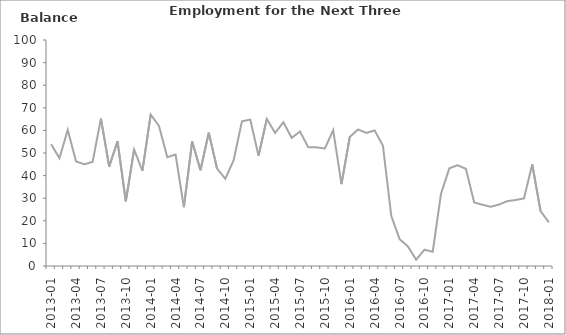
| Category | Balance |
|---|---|
| 2013-01 | 53.9 |
|  | 47.7 |
|  | 60.2 |
| 2013-04 | 46.3 |
|  | 45 |
|  | 46.1 |
| 2013-07 | 65.2 |
|  | 44 |
|  | 55.2 |
| 2013-10 | 28.6 |
|  | 51.5 |
|  | 42.1 |
| 2014-01 | 67 |
|  | 62 |
|  | 48.1 |
| 2014-04 | 49.3 |
|  | 26 |
|  | 55.1 |
| 2014-07 | 42.4 |
|  | 59 |
|  | 43.1 |
| 2014-10 | 38.6 |
|  | 46.8 |
|  | 64 |
| 2015-01 | 64.8 |
|  | 48.8 |
|  | 65.1 |
| 2015-04 | 58.9 |
|  | 63.6 |
|  | 56.7 |
| 2015-07 | 59.5 |
|  | 52.5 |
|  | 52.5 |
| 2015-10 | 52 |
|  | 60.1 |
|  | 36.2 |
| 2016-01 | 57.1 |
|  | 60.4 |
|  | 58.9 |
| 2016-04 | 60 |
|  | 53.2 |
|  | 22.2 |
| 2016-07 | 11.9 |
|  | 8.7 |
|  | 2.8 |
| 2016-10 | 7.2 |
|  | 6.3 |
|  | 32 |
| 2017-01 | 43.2 |
|  | 44.6 |
|  | 43 |
| 2017-04 | 28.1 |
|  | 27.1 |
|  | 26.2 |
| 2017-07 | 27.2 |
|  | 28.7 |
|  | 29.2 |
| 2017-10 | 29.9 |
|  | 45 |
|  | 24.3 |
| 2018-01 | 19.3 |